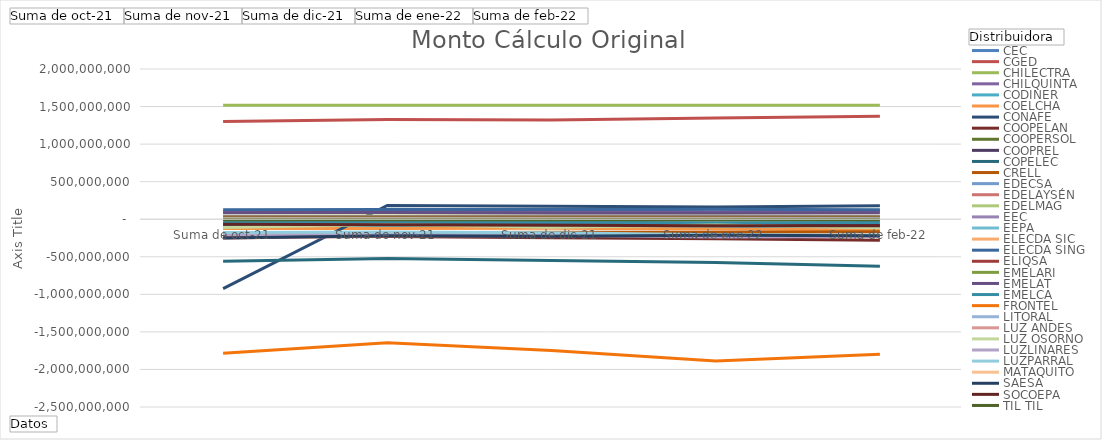
| Category | CEC | CGED | CHILECTRA | CHILQUINTA | CODINER | COELCHA | CONAFE | COOPELAN | COOPERSOL | COOPREL | COPELEC | CRELL | EDECSA | EDELAYSÉN | EDELMAG | EEC | EEPA | ELECDA SIC | ELECDA SING | ELIQSA | EMELARI | EMELAT | EMELCA | FRONTEL | LITORAL | LUZ ANDES | LUZ OSORNO | LUZLINARES | LUZPARRAL | MATAQUITO | SAESA | SOCOEPA | TIL TIL |
|---|---|---|---|---|---|---|---|---|---|---|---|---|---|---|---|---|---|---|---|---|---|---|---|---|---|---|---|---|---|---|---|---|---|
| Suma de oct-21 | 14781095.069 | 1302572807.812 | 1516380251.498 | 100671908.224 | -91199903.066 | -124862488.485 | -923270344.547 | -235357969.602 | -4752325.161 | -63701029.233 | -559553806.748 | -183143199.477 | 8177220.357 | -250793136.539 | 40143143.778 | 12184804.534 | 30030745.702 | 1871505.523 | 126461473.24 | 29554759.001 | 16230038.098 | 84931662.664 | -42744821.629 | -1785886906.685 | 7026918.758 | 0 | -111815314.399 | -205128841.56 | -176209168.662 | -1768261.911 | -250011610.971 | -67261591.833 | -6094442.551 |
| Suma de nov-21 | 15483567.916 | 1328526619.94 | 1516380242.607 | 107398700.673 | -90042511 | -123466260.417 | 182975203.348 | -229597102.21 | -3963011.273 | -67783616.559 | -523035370.948 | -181730960.254 | 8019541.78 | -222003154.63 | 44347462.729 | 12184804.534 | 28967182.095 | 2007040.003 | 127914701.111 | 30864438.137 | 16949203.147 | 89772617.037 | -39923913.83 | -1644409952.592 | 7028386.424 | 0 | -70954416.562 | -194802193.586 | -169866516.235 | -1797559.644 | -218622142.33 | -75193973.755 | -6094442.551 |
| Suma de dic-21 | 15339019.53 | 1319661090.619 | 1516380242.607 | 108833267.178 | -95275808.034 | -120065700.99 | 172125787.054 | -247774248.381 | -3977972.92 | -64514158.868 | -547978476.357 | -172332386.999 | 7892681.779 | -221170807.923 | 41471263.873 | 12184804.534 | 29725194.62 | 2124402.904 | 130904059.085 | 28706197.507 | 17075165.725 | 83635133.114 | -41079410.431 | -1746354966.311 | 6854091.17 | 0 | -107282694.989 | -214746415.981 | -180754237.229 | -1864473.464 | -228082908.953 | -79981865.019 | -6144059.477 |
| Suma de ene-22 | 15698363.606 | 1347543716.451 | 1516380242.607 | 100145568.721 | -100444712.832 | -129328132.244 | 163398172.377 | -261590828.049 | -3707897.697 | -71565649.686 | -577142918.975 | -173553929.685 | 7739890.594 | -215457800.869 | 41596703.916 | 12184804.534 | 31301336.923 | 2010745.018 | 133502431.946 | 31193012.748 | 16709434.793 | 81733583.1 | -45371837.091 | -1888376767.868 | 7243994.45 | 0 | -75810550.514 | -238117230.245 | -206491415.269 | -1864473.464 | -213795147.891 | -88314835.631 | -6992913.975 |
| Suma de feb-22 | 15903497.091 | 1371089885.883 | 1516380242.607 | 115721424.981 | -105506719.676 | -142286250.196 | 177906302.212 | -281161330.73 | -4383642.761 | -76763939.6 | -626674781.49 | -166009803.279 | 7881473.914 | -219915958.153 | 40521081.726 | 12184804.534 | 29556380.302 | 2008378.317 | 125577429.22 | 30479400.027 | 16617796.027 | 87506752.138 | -43150039.799 | -1796954431.601 | 7048858.647 | 0 | -112181432.817 | -229483586.773 | -214235778.155 | -2498442.15 | -219396905.152 | -88355236.482 | -6815660.235 |